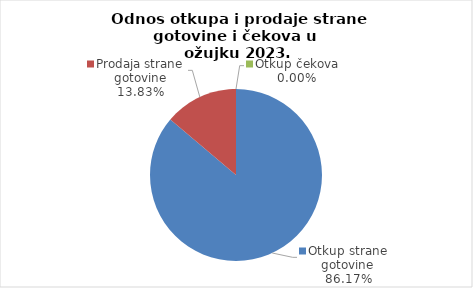
| Category | Series 0 |
|---|---|
| Otkup strane gotovine | 86.17 |
| Prodaja strane gotovine | 13.83 |
| Otkup čekova | 0 |